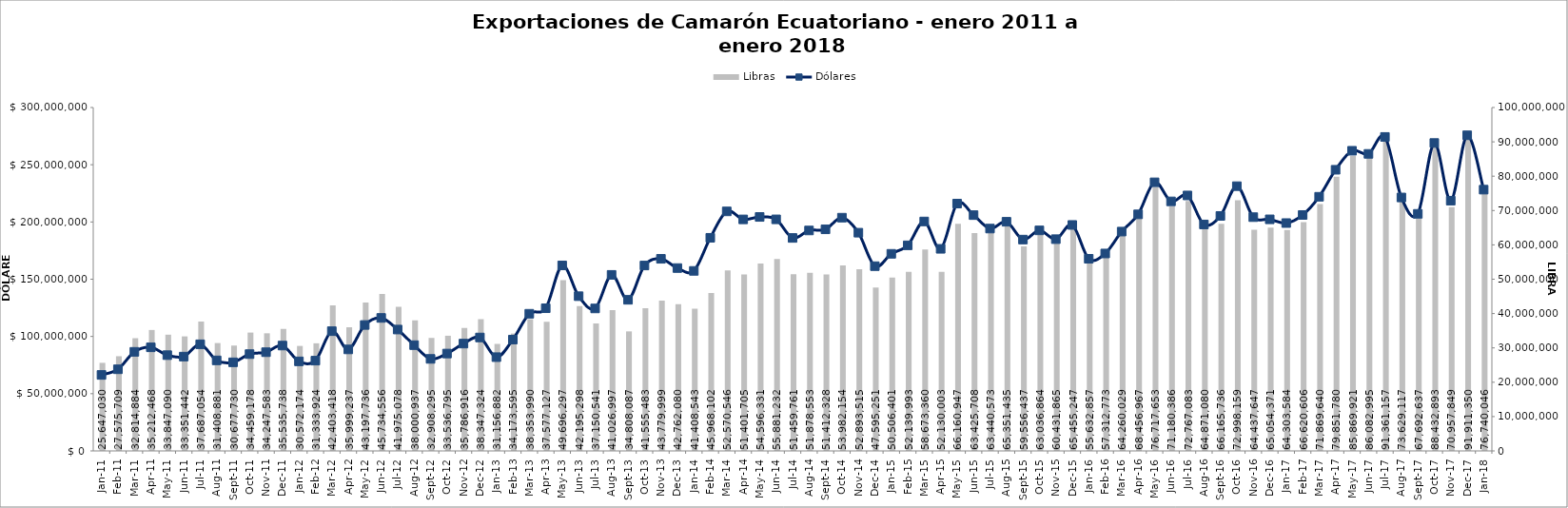
| Category | Libras  |
|---|---|
| 2011-01-01 | 25647030 |
| 2011-02-01 | 27575709 |
| 2011-03-01 | 32814884 |
| 2011-04-01 | 35212468 |
| 2011-05-01 | 33847090 |
| 2011-06-01 | 33351442 |
| 2011-07-01 | 37687054 |
| 2011-08-01 | 31408881 |
| 2011-09-01 | 30677730 |
| 2011-10-01 | 34459178 |
| 2011-11-01 | 34247583 |
| 2011-12-01 | 35535738 |
| 2012-01-01 | 30572174 |
| 2012-02-01 | 31333924 |
| 2012-03-01 | 42403418 |
| 2012-04-01 | 35999237 |
| 2012-05-01 | 43197736 |
| 2012-06-01 | 45734556 |
| 2012-07-01 | 41975078 |
| 2012-08-01 | 38000937 |
| 2012-09-01 | 32908295 |
| 2012-10-01 | 33536795 |
| 2012-11-01 | 35786916 |
| 2012-12-01 | 38347324 |
| 2013-01-01 | 31156882 |
| 2013-02-01 | 34173595 |
| 2013-03-01 | 38353990 |
| 2013-04-01 | 37577127 |
| 2013-05-01 | 49696297 |
| 2013-06-01 | 42195298 |
| 2013-07-01 | 37150541 |
| 2013-08-01 | 41026997 |
| 2013-09-01 | 34808087 |
| 2013-10-01 | 41555483 |
| 2013-11-01 | 43779999 |
| 2013-12-01 | 42762080 |
| 2014-01-01 | 41408543 |
| 2014-02-01 | 45968102 |
| 2014-03-01 | 52570546 |
| 2014-04-01 | 51401705 |
| 2014-05-01 | 54596331 |
| 2014-06-01 | 55881232 |
| 2014-07-01 | 51459761 |
| 2014-08-01 | 51878553 |
| 2014-09-01 | 51412328 |
| 2014-10-01 | 53982154 |
| 2014-11-01 | 52893515 |
| 2014-12-01 | 47595251 |
| 2015-01-01 | 50506401 |
| 2015-02-01 | 52139993 |
| 2015-03-01 | 58673360 |
| 2015-04-01 | 52130003 |
| 2015-05-01 | 66160947 |
| 2015-06-01 | 63425708 |
| 2015-07-01 | 63440573 |
| 2015-08-01 | 65351435 |
| 2015-09-01 | 59556437 |
| 2015-10-01 | 63036864 |
| 2015-11-01 | 60431865 |
| 2015-12-01 | 65455247 |
| 2016-01-01 | 55632857 |
| 2016-02-01 | 57312773 |
| 2016-03-01 | 64260029 |
| 2016-04-01 | 68456967 |
| 2016-05-01 | 76717653 |
| 2016-06-01 | 71180386 |
| 2016-07-01 | 72767083 |
| 2016-08-01 | 64871080 |
| 2016-09-01 | 66165736 |
| 2016-10-01 | 72998159 |
| 2016-11-01 | 64437647 |
| 2016-12-01 | 65054371 |
| 2017-01-01 | 64303584 |
| 2017-02-01 | 66620606 |
| 2017-03-01 | 71869640 |
| 2017-04-01 | 79851780 |
| 2017-05-01 | 85869921 |
| 2017-06-01 | 86082995 |
| 2017-07-01 | 91361157 |
| 2017-08-01 | 73629117 |
| 2017-09-01 | 67692637 |
| 2017-10-01 | 88432893 |
| 2017-11-01 | 70957849 |
| 2017-12-01 | 91911350 |
| 2018-01-01 | 76740046 |